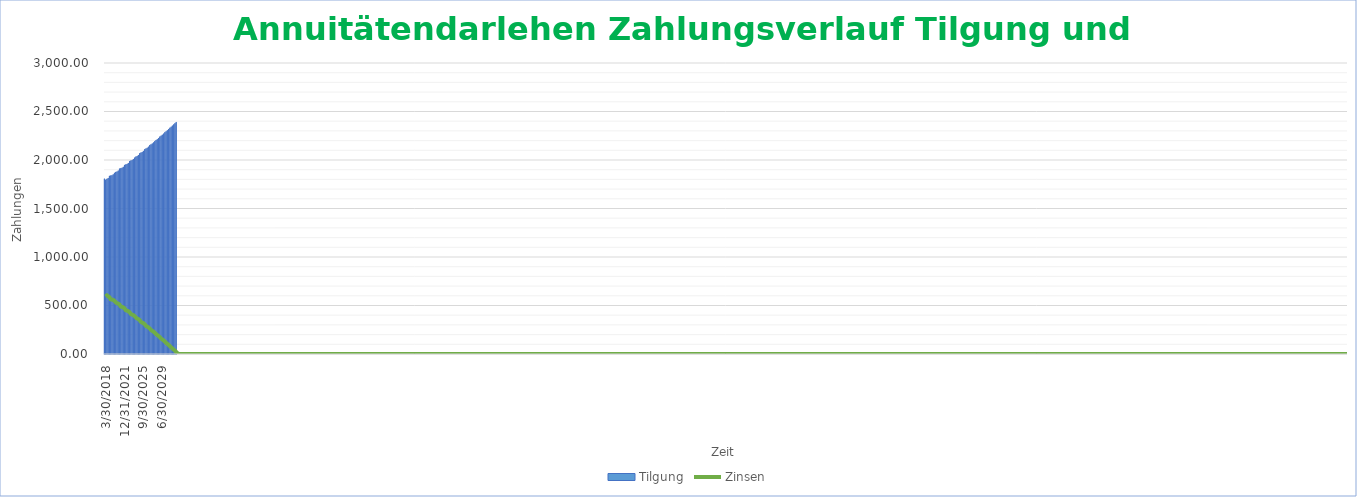
| Category | Tilgung |
|---|---|
| 30.03.2018 | 1806.667 |
| 30.06.2018 | 1795.901 |
| 30.09.2018 | 1805.08 |
| 31.12.2018 | 1814.306 |
| 31.03.2019 | 1836.11 |
| 30.06.2019 | 1839.127 |
| 30.09.2019 | 1842.363 |
| 31.12.2019 | 1851.78 |
| 31.03.2020 | 1867.101 |
| 30.06.2020 | 1876.54 |
| 30.09.2020 | 1880.379 |
| 31.12.2020 | 1889.99 |
| 31.03.2021 | 1910.527 |
| 30.06.2021 | 1914.747 |
| 30.09.2021 | 1919.201 |
| 31.12.2021 | 1929.01 |
| 31.03.2022 | 1948.894 |
| 30.06.2022 | 1953.735 |
| 30.09.2022 | 1958.816 |
| 31.12.2022 | 1968.828 |
| 31.03.2023 | 1988.045 |
| 30.06.2023 | 1993.519 |
| 30.09.2023 | 1999.241 |
| 31.12.2023 | 2009.46 |
| 31.03.2024 | 2023.863 |
| 30.06.2024 | 2034.095 |
| 30.09.2024 | 2040.471 |
| 31.12.2024 | 2050.9 |
| 31.03.2025 | 2068.743 |
| 30.06.2025 | 2075.521 |
| 30.09.2025 | 2082.564 |
| 31.12.2025 | 2093.208 |
| 31.03.2026 | 2110.344 |
| 30.06.2026 | 2117.794 |
| 30.09.2026 | 2125.517 |
| 31.12.2026 | 2136.381 |
| 31.03.2027 | 2152.794 |
| 30.06.2027 | 2160.931 |
| 30.09.2027 | 2169.348 |
| 31.12.2027 | 2180.436 |
| 31.03.2028 | 2193.846 |
| 30.06.2028 | 2204.937 |
| 30.09.2028 | 2214.063 |
| 31.12.2028 | 2225.38 |
| 31.03.2029 | 2240.303 |
| 30.06.2029 | 2249.854 |
| 30.09.2029 | 2259.703 |
| 31.12.2029 | 2271.253 |
| 31.03.2030 | 2285.408 |
| 30.06.2030 | 2295.689 |
| 30.09.2030 | 2306.276 |
| 31.12.2030 | 2318.064 |
| 31.03.2031 | 2331.435 |
| 30.06.2031 | 2342.46 |
| 30.09.2031 | 2353.8 |
| 31.12.2031 | 2365.831 |
| 31.03.2032 | 2378.163 |
| 30.06.2032 | 2390.186 |